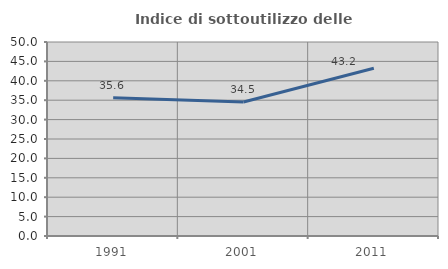
| Category | Indice di sottoutilizzo delle abitazioni  |
|---|---|
| 1991.0 | 35.608 |
| 2001.0 | 34.541 |
| 2011.0 | 43.241 |